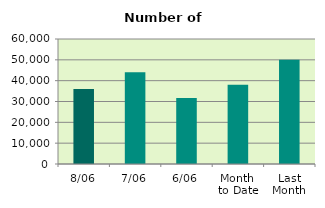
| Category | Series 0 |
|---|---|
| 8/06 | 36044 |
| 7/06 | 44048 |
| 6/06 | 31670 |
| Month 
to Date | 38100 |
| Last
Month | 50099.545 |